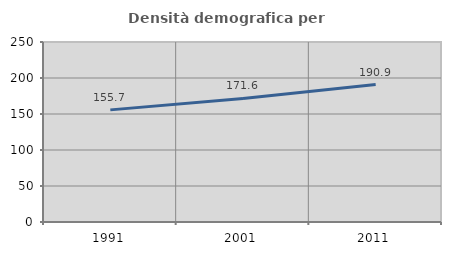
| Category | Densità demografica |
|---|---|
| 1991.0 | 155.733 |
| 2001.0 | 171.585 |
| 2011.0 | 190.946 |